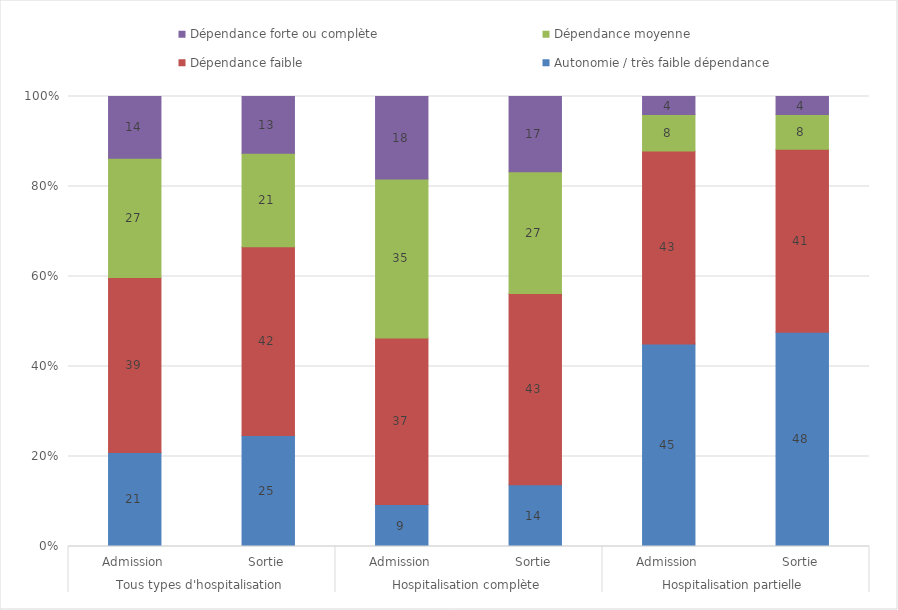
| Category | Autonomie / très faible dépendance  | Dépendance faible | Dépendance moyenne | Dépendance forte ou complète |
|---|---|---|---|---|
| 0 | 20.9 | 38.9 | 26.5 | 13.7 |
| 1 | 24.7 | 42 | 20.8 | 12.6 |
| 2 | 9.3 | 37 | 35.3 | 18.3 |
| 3 | 13.7 | 42.5 | 27.1 | 16.7 |
| 4 | 45 | 42.9 | 8.1 | 4 |
| 5 | 47.6 | 40.7 | 7.7 | 4 |